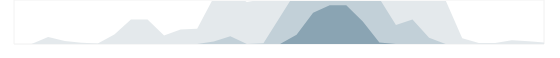
| Category | Маркетинг | Series 1 | Series 2 | Series 3 |
|---|---|---|---|---|
| 0.333333333333333 | 0 | 0 | 0 | 0 |
| nan | 0 | 0 | 0 | 0 |
| nan | 118 | 0 | 0 | 0 |
| nan | 53 | 0 | 0 | 0 |
| 0.416666666666667 | 20 | 0 | 0 | 0 |
| nan | 9 | 0 | 0 | 0 |
| nan | 163 | 0 | 0 | 0 |
| nan | 418 | 0 | 0 | 0 |
| 0.5 | 419 | 0 | 0 | 0 |
| nan | 145 | 0 | 0 | 0 |
| nan | 249 | 0 | 0 | 0 |
| nan | 261 | 0 | 0 | 0 |
| 0.583333333333333 | 793 | 43 | 0 | 0 |
| nan | 881 | 131 | 0 | 0 |
| nan | 717 | 0 | 0 | 0 |
| nan | 762 | 12 | 0 | 0 |
| 0.666666666666667 | 1212 | 462 | 0 | 0 |
| nan | 1658 | 908 | 158 | 0 |
| nan | 2032 | 1282 | 532 | 0 |
| nan | 2160 | 1410 | 660 | 0 |
| 0.75 | 2162 | 1412 | 662 | 0 |
| nan | 1885 | 1135 | 385 | 0 |
| nan | 1525 | 775 | 25 | 0 |
| nan | 1075 | 325 | 0 | 0 |
| 0.833333333333333 | 1168 | 418 | 0 | 0 |
| nan | 855 | 105 | 0 | 0 |
| nan | 743 | 0 | 0 | 0 |
| nan | 96 | 0 | 0 | 0 |
| 0.916666666666667 | 19 | 0 | 0 | 0 |
| nan | 19 | 0 | 0 | 0 |
| nan | 66 | 0 | 0 | 0 |
| nan | 49 | 0 | 0 | 0 |
| 0.9993055555555556 | 24 | 0 | 0 | 0 |